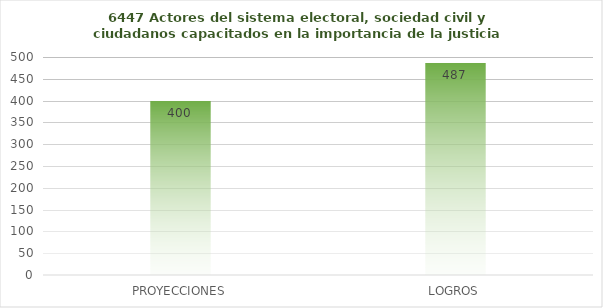
| Category | 6447 |
|---|---|
| PROYECCIONES | 400 |
| LOGROS | 487 |